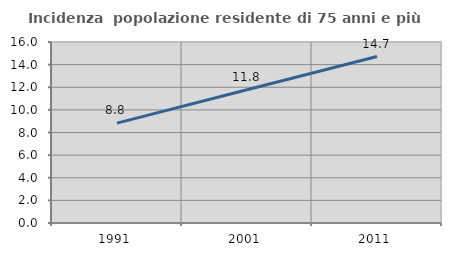
| Category | Incidenza  popolazione residente di 75 anni e più |
|---|---|
| 1991.0 | 8.825 |
| 2001.0 | 11.773 |
| 2011.0 | 14.716 |